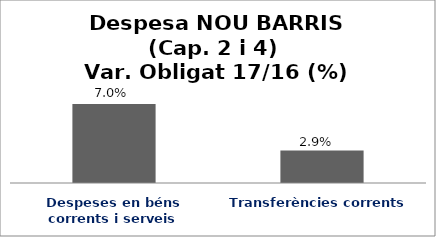
| Category | Series 0 |
|---|---|
| Despeses en béns corrents i serveis | 0.07 |
| Transferències corrents | 0.029 |